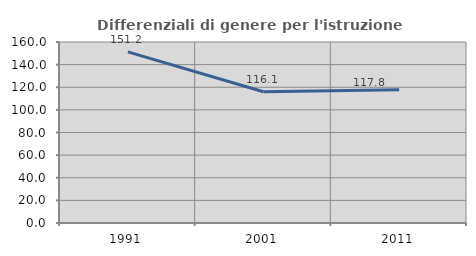
| Category | Differenziali di genere per l'istruzione superiore |
|---|---|
| 1991.0 | 151.237 |
| 2001.0 | 116.065 |
| 2011.0 | 117.798 |